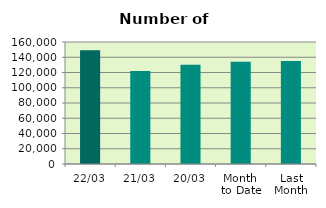
| Category | Series 0 |
|---|---|
| 22/03 | 149072 |
| 21/03 | 122008 |
| 20/03 | 130258 |
| Month 
to Date | 134216.25 |
| Last
Month | 135041.7 |